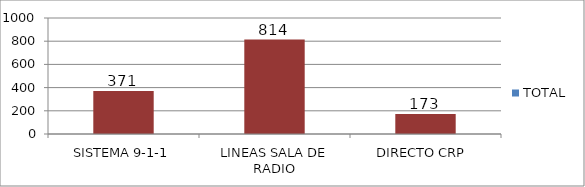
| Category | TOTAL |
|---|---|
| SISTEMA 9-1-1 | 371 |
| LINEAS SALA DE RADIO | 814 |
| DIRECTO CRP  | 173 |